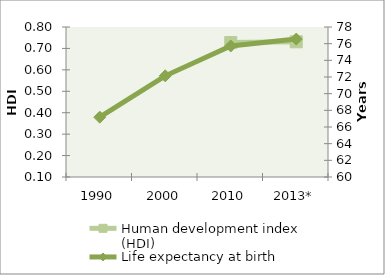
| Category | Human development index (HDI) |
|---|---|
| 1990 | 0 |
| 2000 | 0 |
| 2010 | 0.728 |
| 2013* | 0.731 |